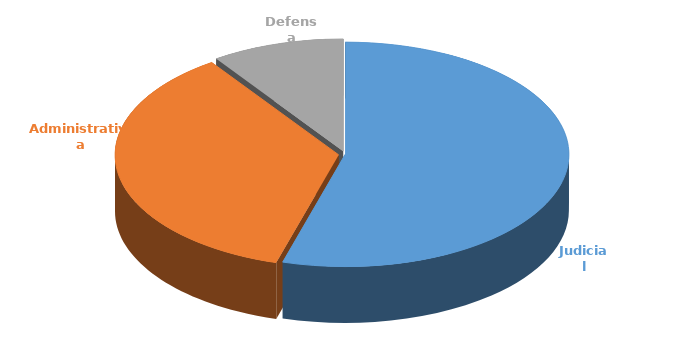
| Category | Cantidad |
|---|---|
| Judicial | 363 |
| Administrativa | 239 |
| Defensa | 64 |